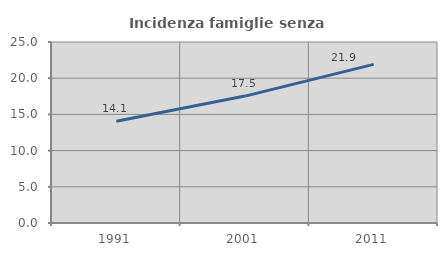
| Category | Incidenza famiglie senza nuclei |
|---|---|
| 1991.0 | 14.061 |
| 2001.0 | 17.53 |
| 2011.0 | 21.915 |